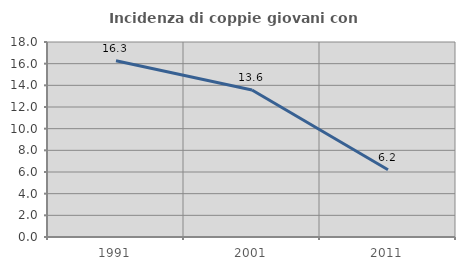
| Category | Incidenza di coppie giovani con figli |
|---|---|
| 1991.0 | 16.269 |
| 2001.0 | 13.573 |
| 2011.0 | 6.212 |